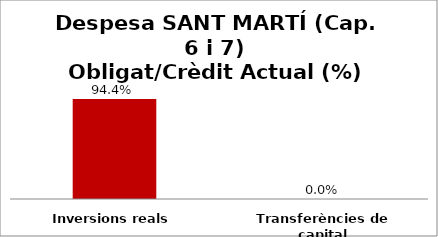
| Category | Series 0 |
|---|---|
| Inversions reals | 0.944 |
| Transferències de capital | 0 |